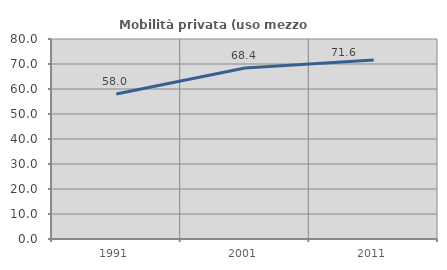
| Category | Mobilità privata (uso mezzo privato) |
|---|---|
| 1991.0 | 58.01 |
| 2001.0 | 68.421 |
| 2011.0 | 71.633 |